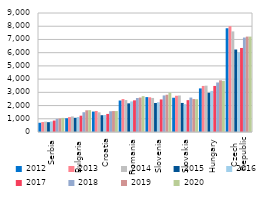
| Category | 2012 | 2013 | 2014 | 2015 | 2016 | 2017 | 2018 | 2019 | 2020 |
|---|---|---|---|---|---|---|---|---|---|
| Serbia | 698 | 752 | 784 | 743 | 801 | 866 | 996 | 1021 | 1067 |
| Bulgaria | 1038 | 1128 | 1175 | 1074 | 1134 | 1234 | 1495 | 1641 | 1651 |
| Croatia | 1545 | 1591 | 1489 | 1270 | 1287 | 1367 | 1570 | 1583 | 1584 |
| Romania | 2381 | 2491 | 2414 | 2167 | 2313 | 2395 | 2573 | 2604 | 2710 |
| Slovenia | 2639 | 2626 | 2574 | 2192 | 2251 | 2462 | 2765 | 2819 | 2977 |
| Slovakia | 2591 | 2741 | 2761 | 2198 | 2106 | 2410 | 2604 | 2490 | 2477 |
| Hungary | 3297 | 3484 | 3505 | 2964 | 3108 | 3484 | 3745 | 3909 | 3868 |
| Czech 
Republic | 7846 | 7998 | 7608 | 6238 | 6009 | 6356 | 7144 | 7215 | 7215 |